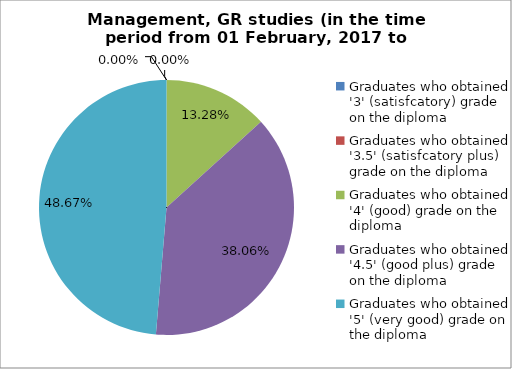
| Category | Series 0 |
|---|---|
| Graduates who obtained '3' (satisfcatory) grade on the diploma | 0 |
| Graduates who obtained '3.5' (satisfcatory plus) grade on the diploma | 0 |
| Graduates who obtained '4' (good) grade on the diploma | 13.274 |
| Graduates who obtained '4.5' (good plus) grade on the diploma | 38.053 |
| Graduates who obtained '5' (very good) grade on the diploma | 48.673 |